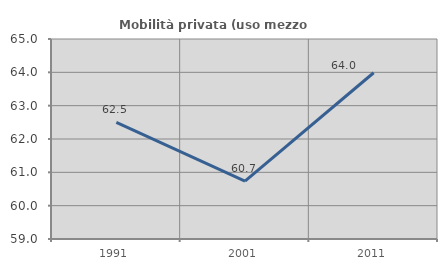
| Category | Mobilità privata (uso mezzo privato) |
|---|---|
| 1991.0 | 62.5 |
| 2001.0 | 60.738 |
| 2011.0 | 63.987 |